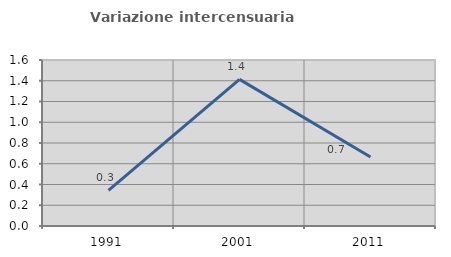
| Category | Variazione intercensuaria annua |
|---|---|
| 1991.0 | 0.343 |
| 2001.0 | 1.413 |
| 2011.0 | 0.666 |